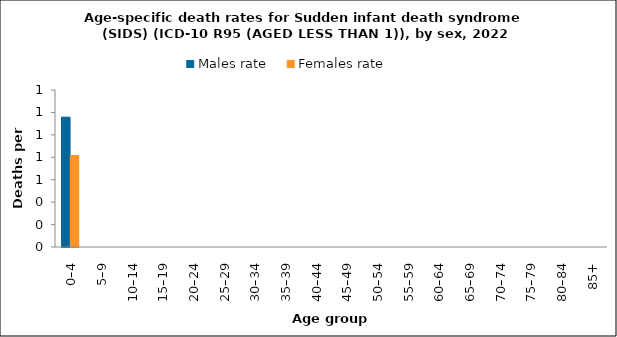
| Category | Males rate | Females rate |
|---|---|---|
| 0–4 | 1.158 | 0.815 |
| 5–9 | 0 | 0 |
| 10–14 | 0 | 0 |
| 15–19 | 0 | 0 |
| 20–24 | 0 | 0 |
| 25–29 | 0 | 0 |
| 30–34 | 0 | 0 |
| 35–39 | 0 | 0 |
| 40–44 | 0 | 0 |
| 45–49 | 0 | 0 |
| 50–54 | 0 | 0 |
| 55–59 | 0 | 0 |
| 60–64 | 0 | 0 |
| 65–69 | 0 | 0 |
| 70–74 | 0 | 0 |
| 75–79 | 0 | 0 |
| 80–84 | 0 | 0 |
| 85+ | 0 | 0 |